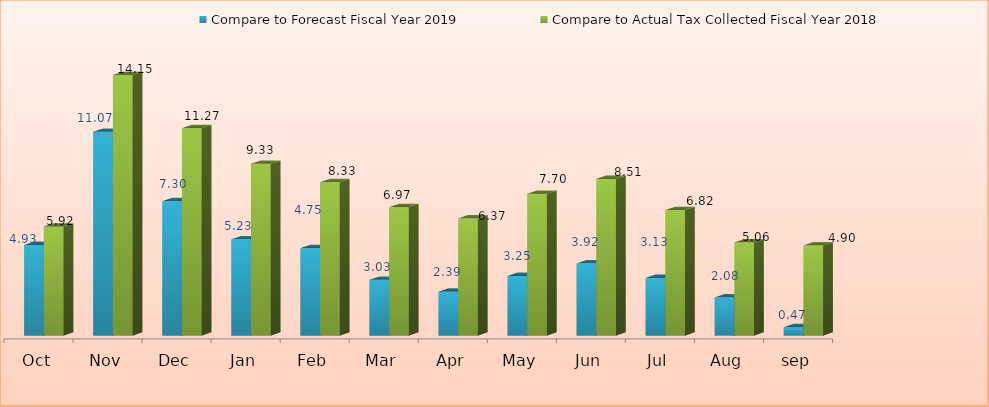
| Category | Compare to Forecast Fiscal Year 2019 | Compare to Actual Tax Collected Fiscal Year 2018 |
|---|---|---|
| Oct | 4.929 | 5.923 |
| Nov | 11.069 | 14.148 |
| Dec | 7.3 | 11.267 |
| Jan | 5.233 | 9.331 |
| Feb | 4.752 | 8.329 |
| Mar | 3.033 | 6.973 |
| Apr | 2.388 | 6.365 |
| May | 3.247 | 7.704 |
| Jun | 3.922 | 8.509 |
| Jul | 3.132 | 6.819 |
| Aug | 2.077 | 5.063 |
| sep | 0.466 | 4.9 |